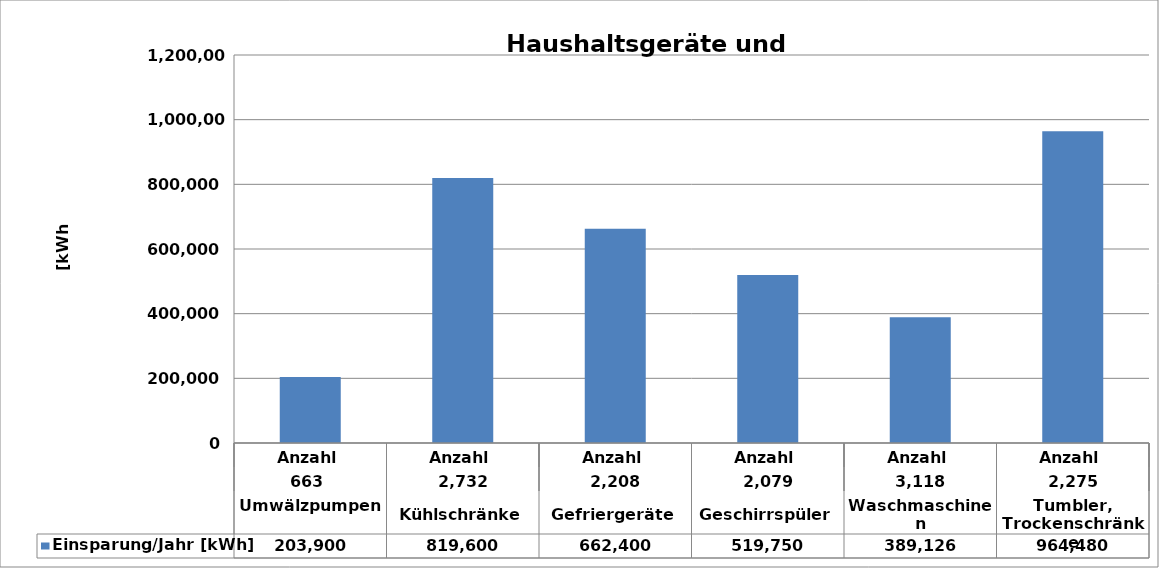
| Category | Einsparung/Jahr [kWh] |
|---|---|
| 0 | 203900 |
| 1 | 819600 |
| 2 | 662400 |
| 3 | 519750 |
| 4 | 389126.4 |
| 5 | 964480 |